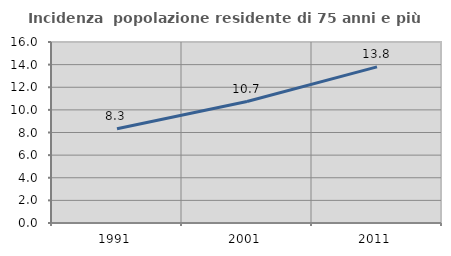
| Category | Incidenza  popolazione residente di 75 anni e più |
|---|---|
| 1991.0 | 8.326 |
| 2001.0 | 10.739 |
| 2011.0 | 13.803 |